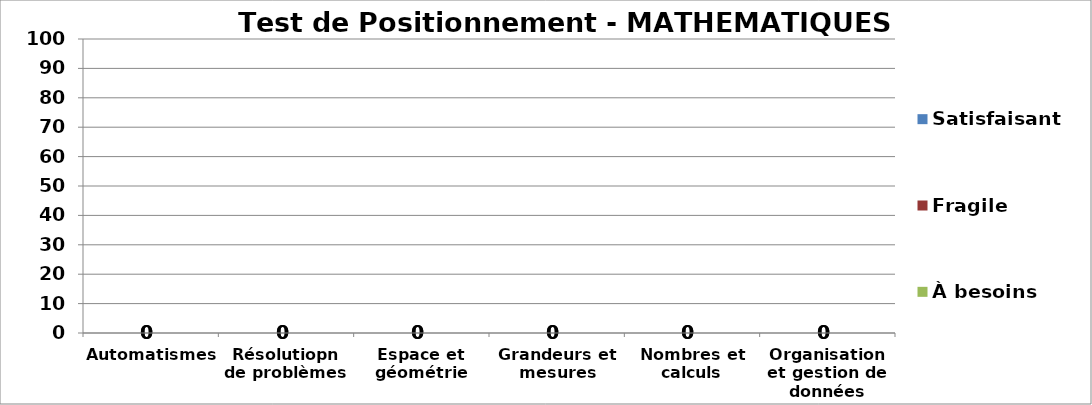
| Category | À besoins | Fragile | Satisfaisant |
|---|---|---|---|
| Automatismes | 0 | 0 | 0 |
| Résolutiopn de problèmes | 0 | 0 | 0 |
| Espace et géométrie | 0 | 0 | 0 |
| Grandeurs et mesures | 0 | 0 | 0 |
| Nombres et calculs | 0 | 0 | 0 |
| Organisation et gestion de données | 0 | 0 | 0 |